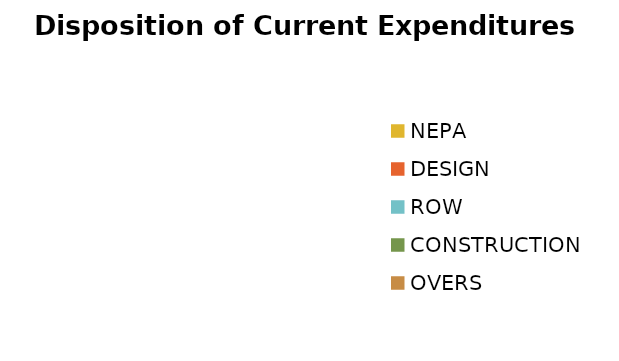
| Category | Series 0 |
|---|---|
| NEPA | 0 |
| DESIGN | 0 |
| ROW | 0 |
| CONSTRUCTION | 0 |
| OVERS | 0 |